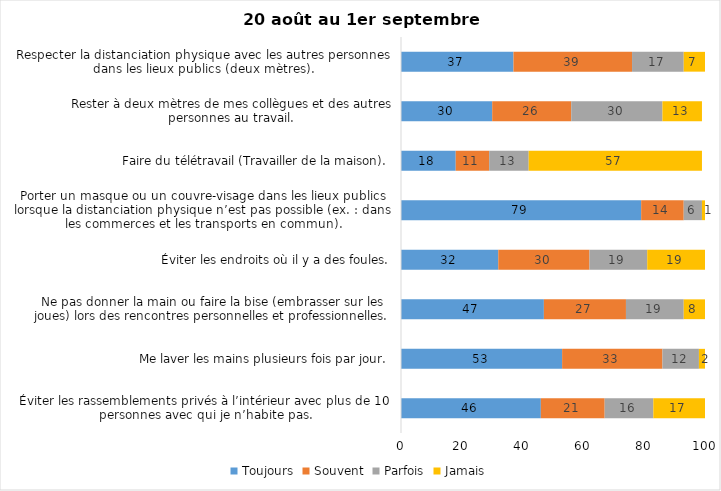
| Category | Toujours | Souvent | Parfois | Jamais |
|---|---|---|---|---|
| Éviter les rassemblements privés à l’intérieur avec plus de 10 personnes avec qui je n’habite pas. | 46 | 21 | 16 | 17 |
| Me laver les mains plusieurs fois par jour. | 53 | 33 | 12 | 2 |
| Ne pas donner la main ou faire la bise (embrasser sur les joues) lors des rencontres personnelles et professionnelles. | 47 | 27 | 19 | 8 |
| Éviter les endroits où il y a des foules. | 32 | 30 | 19 | 19 |
| Porter un masque ou un couvre-visage dans les lieux publics lorsque la distanciation physique n’est pas possible (ex. : dans les commerces et les transports en commun). | 79 | 14 | 6 | 1 |
| Faire du télétravail (Travailler de la maison). | 18 | 11 | 13 | 57 |
| Rester à deux mètres de mes collègues et des autres personnes au travail. | 30 | 26 | 30 | 13 |
| Respecter la distanciation physique avec les autres personnes dans les lieux publics (deux mètres). | 37 | 39 | 17 | 7 |